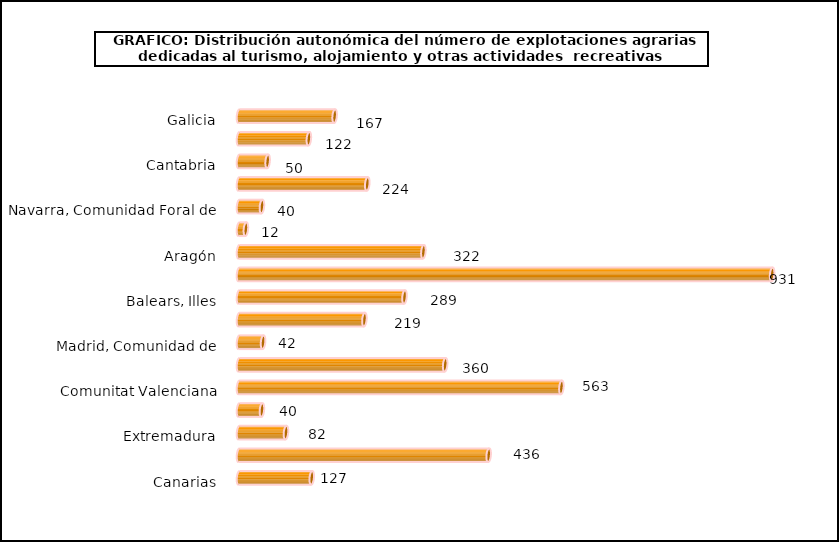
| Category | num. Explotaciones |
|---|---|
| Galicia | 167 |
| Asturias, Principado de | 122 |
| Cantabria | 50 |
| País Vasco | 224 |
| Navarra, Comunidad Foral de | 40 |
| Rioja, La | 12 |
| Aragón | 322 |
| Cataluña | 931 |
| Balears, Illes | 289 |
| Castilla y León | 219 |
| Madrid, Comunidad de | 42 |
| Castilla - La Mancha | 360 |
| Comunitat Valenciana | 563 |
| Murcia, Región de | 40 |
| Extremadura | 82 |
| Andalucía | 436 |
| Canarias | 127 |